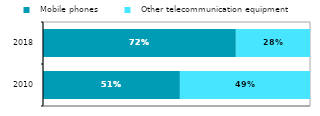
| Category |   Mobile phones |   Other telecommunication equipment |
|---|---|---|
| 2010.0 | 0.513 | 0.487 |
| 2018.0 | 0.722 | 0.278 |